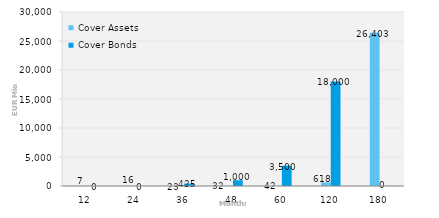
| Category | Cover Assets | Cover Bonds |
|---|---|---|
| 12.0 | 7.181 | 0 |
| 24.0 | 16.491 | 0 |
| 36.0 | 23.249 | 425 |
| 48.0 | 31.661 | 1000 |
| 60.0 | 42.328 | 3500 |
| 120.0 | 617.779 | 18000 |
| 180.0 | 26403.285 | 0 |